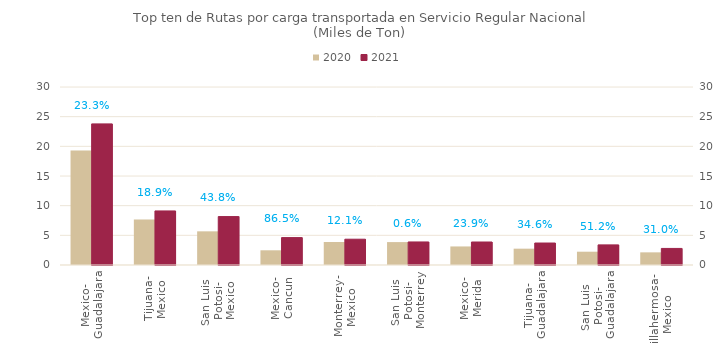
| Category | 2020 | 2021 |
|---|---|---|
| Mexico-
Guadalajara | 19287.365 | 23782.555 |
| Tijuana-
Mexico | 7662.204 | 9112.89 |
| San Luis 
Potosi-
Mexico | 5674.65 | 8160.23 |
| Mexico-
Cancun | 2477.438 | 4620.073 |
| Monterrey-
Mexico | 3876.233 | 4345.557 |
| San Luis 
Potosi-
Monterrey | 3860.967 | 3884.208 |
| Mexico-
Merida | 3127.804 | 3875.952 |
| Tijuana-
Guadalajara | 2752.438 | 3704.52 |
| San Luis 
Potosi-
Guadalajara | 2241.048 | 3388.37 |
| Villahermosa-
Mexico | 2131.708 | 2793.377 |